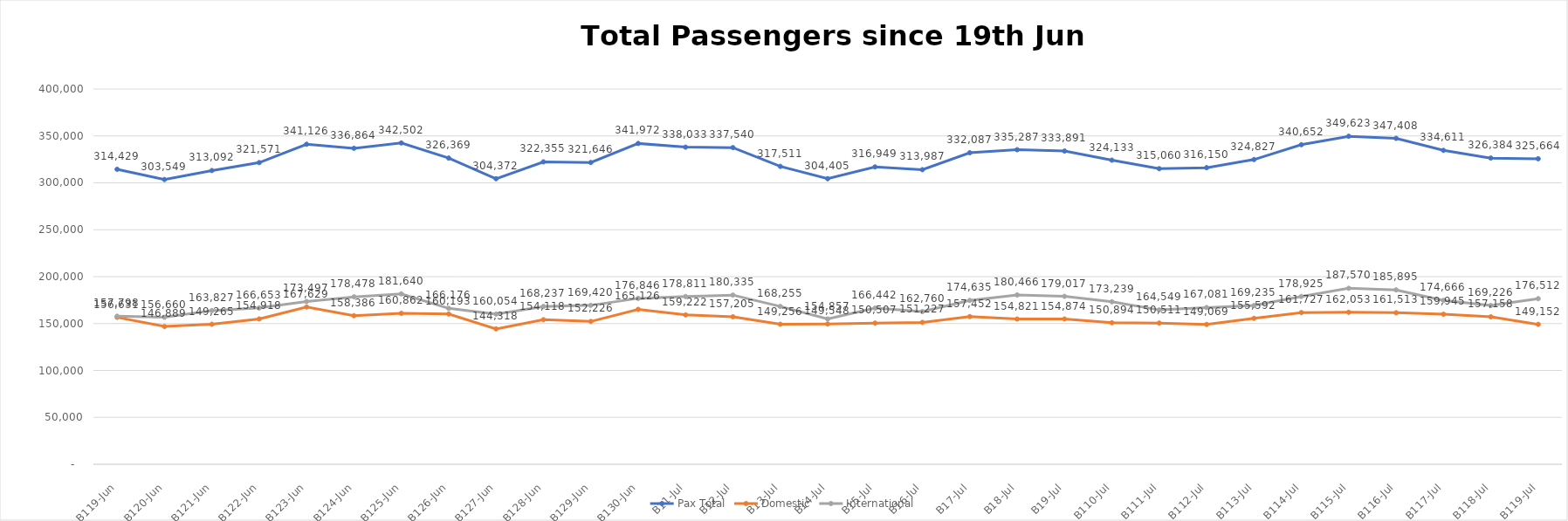
| Category | Pax Total |  Domestic  |  International  |
|---|---|---|---|
| 2023-06-19 | 314429 | 156631 | 157798 |
| 2023-06-20 | 303549 | 146889 | 156660 |
| 2023-06-21 | 313092 | 149265 | 163827 |
| 2023-06-22 | 321571 | 154918 | 166653 |
| 2023-06-23 | 341126 | 167629 | 173497 |
| 2023-06-24 | 336864 | 158386 | 178478 |
| 2023-06-25 | 342502 | 160862 | 181640 |
| 2023-06-26 | 326369 | 160193 | 166176 |
| 2023-06-27 | 304372 | 144318 | 160054 |
| 2023-06-28 | 322355 | 154118 | 168237 |
| 2023-06-29 | 321646 | 152226 | 169420 |
| 2023-06-30 | 341972 | 165126 | 176846 |
| 2023-07-01 | 338033 | 159222 | 178811 |
| 2023-07-02 | 337540 | 157205 | 180335 |
| 2023-07-03 | 317511 | 149256 | 168255 |
| 2023-07-04 | 304405 | 149548 | 154857 |
| 2023-07-05 | 316949 | 150507 | 166442 |
| 2023-07-06 | 313987 | 151227 | 162760 |
| 2023-07-07 | 332087 | 157452 | 174635 |
| 2023-07-08 | 335287 | 154821 | 180466 |
| 2023-07-09 | 333891 | 154874 | 179017 |
| 2023-07-10 | 324133 | 150894 | 173239 |
| 2023-07-11 | 315060 | 150511 | 164549 |
| 2023-07-12 | 316150 | 149069 | 167081 |
| 2023-07-13 | 324827 | 155592 | 169235 |
| 2023-07-14 | 340652 | 161727 | 178925 |
| 2023-07-15 | 349623 | 162053 | 187570 |
| 2023-07-16 | 347408 | 161513 | 185895 |
| 2023-07-17 | 334611 | 159945 | 174666 |
| 2023-07-18 | 326384 | 157158 | 169226 |
| 2023-07-19 | 325664 | 149152 | 176512 |